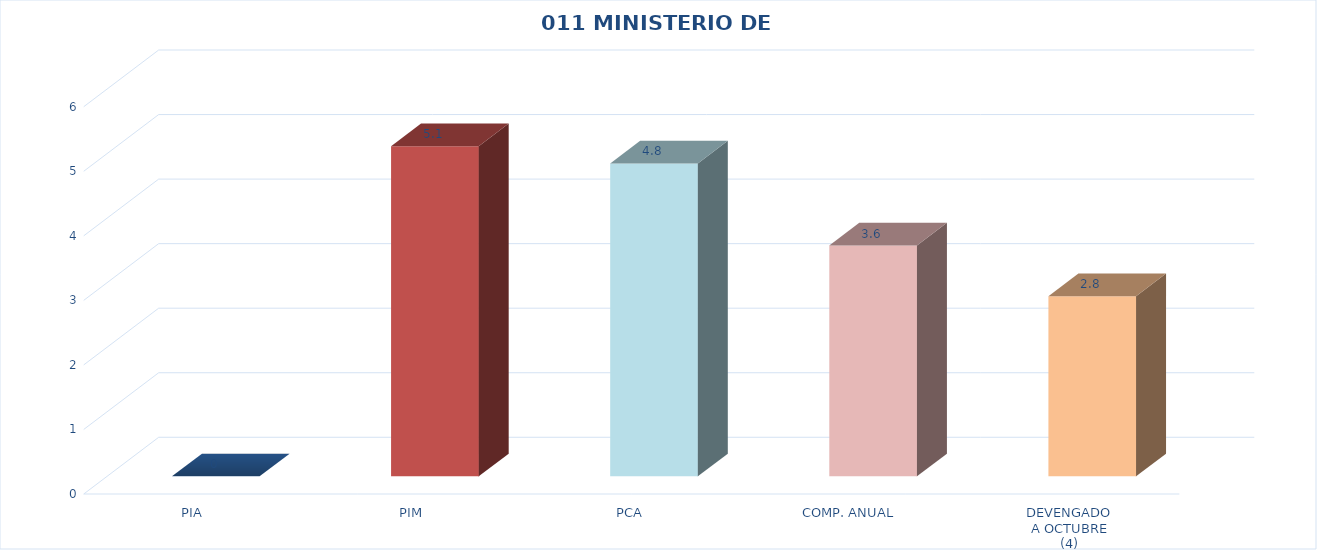
| Category | 011 MINISTERIO DE SALUD |
|---|---|
| PIA | 0 |
| PIM | 5.115 |
| PCA | 4.848 |
| COMP. ANUAL | 3.576 |
| DEVENGADO
A OCTUBRE
(4) | 2.791 |